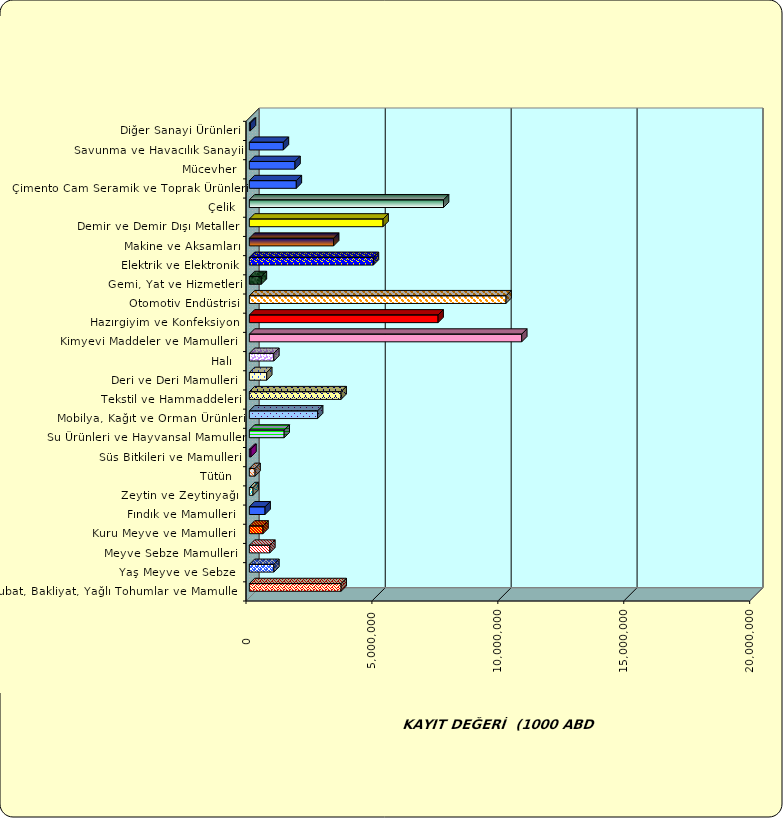
| Category | Series 0 |
|---|---|
|  Hububat, Bakliyat, Yağlı Tohumlar ve Mamulleri  | 3644546.096 |
|  Yaş Meyve ve Sebze   | 974159.923 |
|  Meyve Sebze Mamulleri  | 813400.176 |
|  Kuru Meyve ve Mamulleri   | 542123.043 |
|  Fındık ve Mamulleri  | 624526.243 |
|  Zeytin ve Zeytinyağı  | 145540.795 |
|  Tütün  | 226258.268 |
|  Süs Bitkileri ve Mamulleri | 63258.867 |
|  Su Ürünleri ve Hayvansal Mamuller | 1382693.071 |
|  Mobilya, Kağıt ve Orman Ürünleri | 2710514.594 |
|  Tekstil ve Hammaddeleri | 3643300.634 |
|  Deri ve Deri Mamulleri  | 690144.232 |
|  Halı  | 972227.927 |
|  Kimyevi Maddeler ve Mamulleri   | 10816569.433 |
|  Hazırgiyim ve Konfeksiyon  | 7494189.172 |
|  Otomotiv Endüstrisi | 10192632.581 |
|  Gemi, Yat ve Hizmetleri | 476961.574 |
|  Elektrik ve Elektronik | 4926133.844 |
|  Makine ve Aksamları | 3346739.821 |
|  Demir ve Demir Dışı Metaller  | 5309758.785 |
|  Çelik | 7710850.422 |
|  Çimento Cam Seramik ve Toprak Ürünleri | 1865363.44 |
|  Mücevher | 1812749.607 |
|  Savunma ve Havacılık Sanayii | 1351143.995 |
|  Diğer Sanayi Ürünleri | 43969.545 |